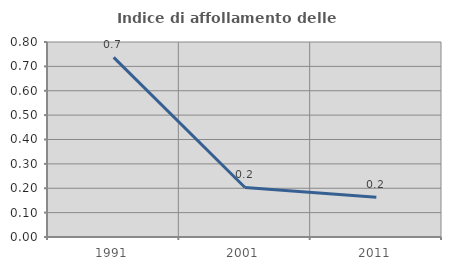
| Category | Indice di affollamento delle abitazioni  |
|---|---|
| 1991.0 | 0.737 |
| 2001.0 | 0.203 |
| 2011.0 | 0.163 |